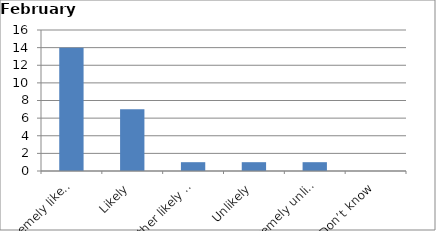
| Category | Series 0 |
|---|---|
| Extremely likely | 14 |
| Likely | 7 |
| Neither likely nor unlikely | 1 |
| Unlikely | 1 |
| Extremely unlikely | 1 |
| Don’t know | 0 |